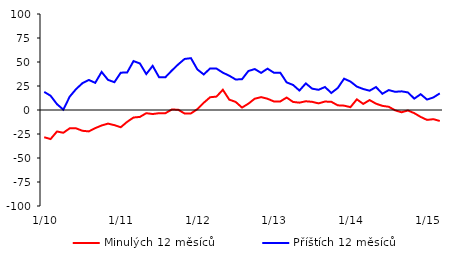
| Category | Minulých 12 měsíců | Příštích 12 měsíců |
|---|---|---|
|  1/10 | -28.38 | 18.87 |
|  2/10 | -30.28 | 14.86 |
|  3/10 | -22.41 | 6.12 |
|  4/10 | -23.71 | 0.35 |
|  5/10 | -19.08 | 13.92 |
|  6/10 | -19.11 | 21.81 |
|  7/10 | -21.66 | 27.94 |
|  8/10 | -22.29 | 31.28 |
|  9/10 | -18.88 | 28.29 |
|  10/10 | -16.12 | 39.67 |
|  11/10 | -14.18 | 31.39 |
|  12/10 | -15.78 | 28.96 |
|  1/11 | -17.96 | 38.89 |
|  2/11 | -12.33 | 39.05 |
|  3/11 | -7.84 | 50.96 |
|  4/11 | -7.2 | 48.47 |
|  5/11 | -3.3 | 37.42 |
|  6/11 | -4.21 | 45.99 |
|  7/11 | -3.33 | 34.17 |
|  8/11 | -3.33 | 34.17 |
|  9/11 | 0.51 | 41.09 |
|  10/11 | 0.28 | 47.47 |
|  11/11 | -3.65 | 53.17 |
|  12/11 | -3.52 | 53.99 |
|  1/12 | 0.85 | 42.3 |
|  2/12 | 7.49 | 37.02 |
|  3/12 | 13.29 | 43.26 |
|  4/12 | 13.96 | 43.14 |
|  5/12 | 21.08 | 38.87 |
|  6/12 | 10.81 | 35.74 |
|  7/12 | 8.46 | 31.81 |
|  8/12 | 2.55 | 32.03 |
|  9/12 | 6.58 | 40.6 |
|  10/12 | 11.79 | 42.65 |
|  11/12 | 13.41 | 38.66 |
|  12/12 | 11.71 | 43.07 |
|  1/13 | 8.92 | 38.82 |
|  2/13 | 8.92 | 38.82 |
|  3/13 | 12.98 | 28.75 |
|  4/13 | 8.4 | 26.12 |
|  5/13 | 7.64 | 20.26 |
|  6/13 | 9.1 | 27.71 |
|  7/13 | 8.51 | 22.2 |
|  8/13 | 6.89 | 21.06 |
|  9/13 | 8.81 | 23.95 |
|  10/13 | 8.54 | 17.76 |
|  11/13 | 4.88 | 22.87 |
|  12/13 | 4.53 | 32.62 |
|  1/14 | 2.99 | 29.64 |
|  2/14 | 11.1 | 24.37 |
|  3/14 | 6.35 | 21.86 |
|  4/14 | 10.34 | 20.09 |
|  5/14 | 6.57 | 23.91 |
|  6/14 | 4.33 | 16.91 |
|  7/14 | 3.35 | 20.75 |
|  8/14 | -0.33 | 18.95 |
|  9/14 | -2.37 | 19.44 |
|  10/14 | -0.5 | 18.32 |
|  11/14 | -3.3 | 11.85 |
|  12/14 | -7.21 | 16.46 |
|  1/15 | -10.32 | 10.88 |
|  2/15 | -9.55 | 13.1 |
|  3/15 | -11.45 | 17.32 |